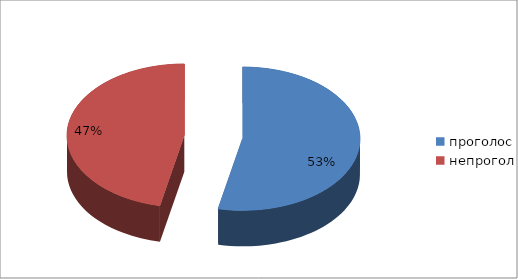
| Category | Series 0 |
|---|---|
| проголос | 72 |
| непрогол | 63 |